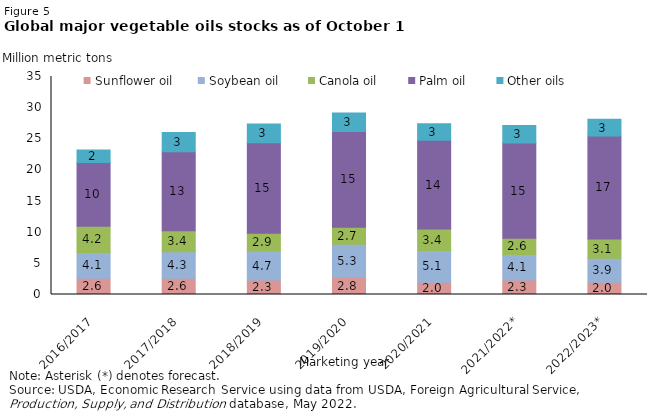
| Category | Sunflower oil | Soybean oil  | Canola oil  | Palm oil  | Other oils |
|---|---|---|---|---|---|
| 2016/2017 | 2.598 | 4.146 | 4.22 | 10.209 | 2.036 |
| 2017/2018 | 2.59 | 4.264 | 3.376 | 12.693 | 3.085 |
| 2018/2019 | 2.309 | 4.663 | 2.862 | 14.533 | 2.998 |
| 2019/2020 | 2.787 | 5.284 | 2.743 | 15.338 | 2.992 |
| 2020/2021 | 1.953 | 5.122 | 3.422 | 14.257 | 2.666 |
| 2021/2022* | 2.331 | 4.092 | 2.615 | 15.273 | 2.826 |
| 2022/2023* | 1.953 | 3.875 | 3.094 | 16.525 | 2.681 |